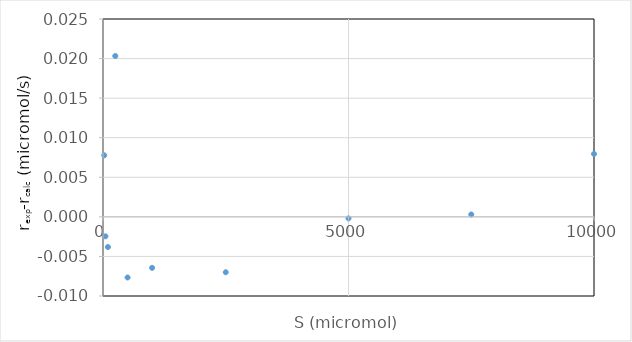
| Category | rexp-rcalc |
|---|---|
| 25.0 | 0.008 |
| 50.0 | -0.002 |
| 100.0 | -0.004 |
| 250.0 | 0.02 |
| 500.0 | -0.008 |
| 1000.0 | -0.006 |
| 2500.0 | -0.007 |
| 5000.0 | 0 |
| 7500.0 | 0 |
| 10000.0 | 0.008 |